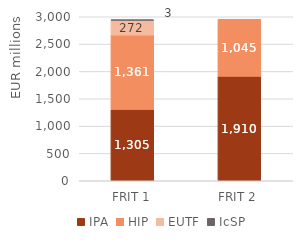
| Category | IPA | HIP | EUTF | IcSP |
|---|---|---|---|---|
| FRIT 1 | 1304.861 | 1361.43 | 271.867 | 2.978 |
| FRIT 2 | 1910 | 1044.712 | 0 | 0 |